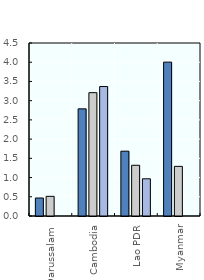
| Category | 2017 | 2018 | Q2 2019 |
|---|---|---|---|
| Brunei Darussalam | 0.468 | 0.511 | 0 |
| Cambodia | 2.787 | 3.208 | 3.367 |
| Lao PDR | 1.686 | 1.32 | 0.968 |
| Myanmar | 4.002 | 1.291 | 0 |